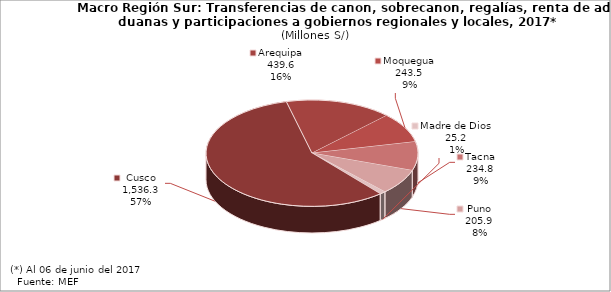
| Category | Series 1 |
|---|---|
| Cusco | 1536.279 |
| Arequipa | 439.63 |
| Moquegua | 243.456 |
| Tacna | 234.81 |
| Puno | 205.912 |
| Madre de Dios | 25.212 |